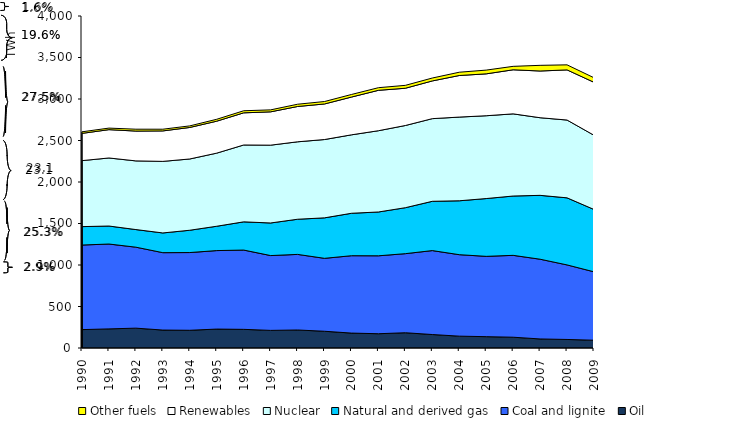
| Category | Oil | Coal and lignite | Natural and derived gas | Nuclear | Renewables | Other fuels |
|---|---|---|---|---|---|---|
| 1990.0 | 221.405 | 1019.013 | 222.117 | 794.863 | 328.273 | 19.109 |
| 1991.0 | 230.258 | 1022.489 | 216.837 | 819.835 | 341.385 | 18.566 |
| 1992.0 | 239.192 | 975.604 | 212.075 | 827.323 | 359.469 | 22.585 |
| 1993.0 | 216.184 | 932.513 | 237.548 | 862.173 | 367.141 | 20.368 |
| 1994.0 | 213.529 | 936.444 | 268.744 | 858.724 | 379.583 | 19.123 |
| 1995.0 | 227.994 | 945.703 | 293.229 | 880.821 | 385.106 | 22.817 |
| 1996.0 | 224.601 | 955.429 | 339.888 | 925.939 | 387.46 | 24.997 |
| 1997.0 | 212.244 | 901.308 | 392.718 | 937.622 | 401.404 | 23.754 |
| 1998.0 | 217.138 | 910.665 | 423.579 | 932.851 | 425.448 | 27.364 |
| 1999.0 | 201.695 | 878.55 | 487.89 | 943.384 | 428.669 | 29.466 |
| 2000.0 | 179.764 | 932.154 | 511.312 | 944.993 | 455.207 | 31.087 |
| 2001.0 | 172.012 | 938.742 | 527.924 | 978.986 | 487.003 | 31.488 |
| 2002.0 | 183.838 | 952.649 | 553.967 | 990.196 | 448.908 | 34.924 |
| 2003.0 | 162.402 | 1011.342 | 593.723 | 995.86 | 454.325 | 35.017 |
| 2004.0 | 142.87 | 981.531 | 649.302 | 1008.437 | 500.835 | 39.667 |
| 2005.0 | 136.541 | 967.595 | 696.37 | 997.699 | 504.771 | 45.267 |
| 2006.0 | 130.028 | 986.162 | 714.881 | 989.877 | 530.929 | 41.449 |
| 2007.0 | 109.042 | 960.619 | 769.485 | 935.277 | 562.78 | 68.36 |
| 2008.0 | 102.851 | 898.21 | 808.198 | 937.215 | 604.147 | 60.749 |
| 2009.0 | 93.765 | 824.151 | 751.129 | 893.99 | 638.078 | 54.715 |